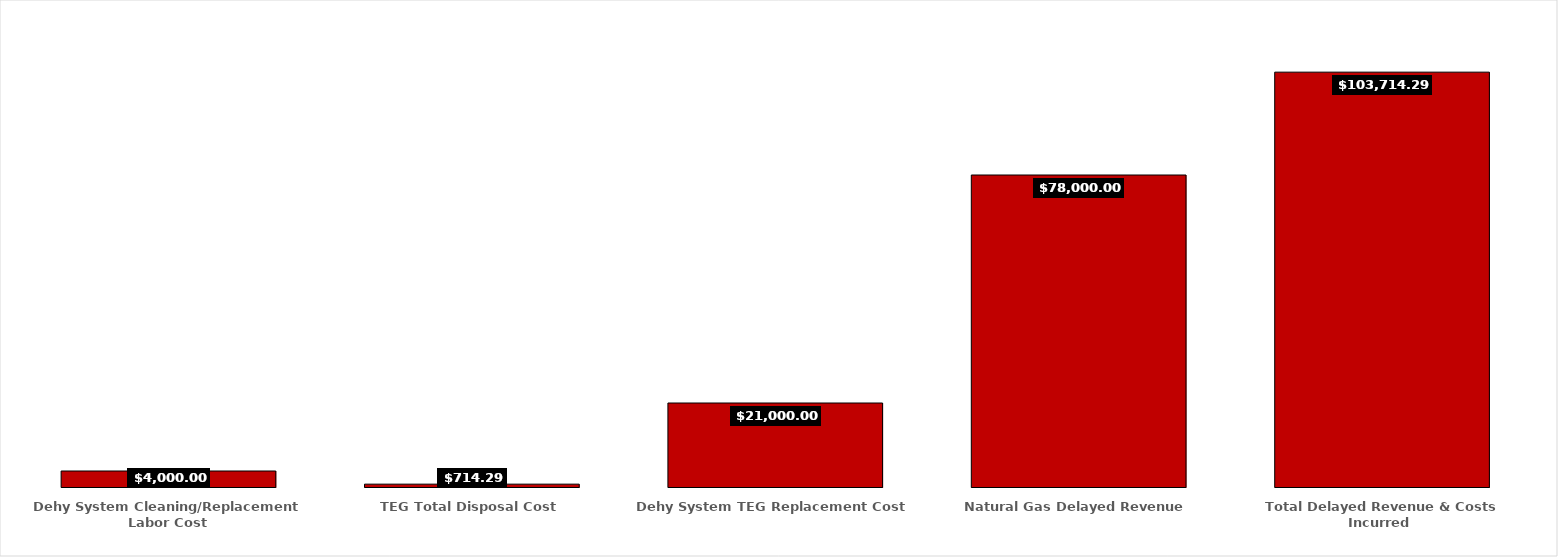
| Category | Series 0 |
|---|---|
| Dehy System Cleaning/Replacement Labor Cost | 4000 |
| TEG Total Disposal Cost | 714.286 |
| Dehy System TEG Replacement Cost | 21000 |
| Natural Gas Delayed Revenue | 78000 |
| Total Delayed Revenue & Costs Incurred  | 103714.286 |